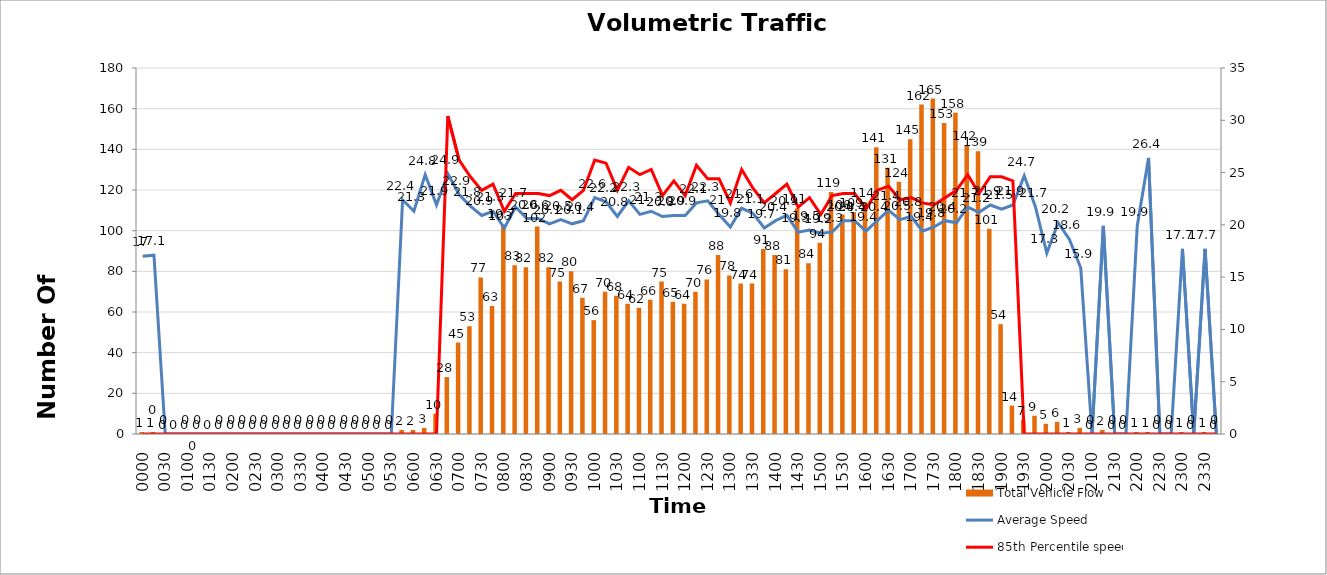
| Category | Total Vehicle Flow |
|---|---|
| 0000 | 1 |
| 0015 | 1 |
| 0030 | 0 |
| 0045 | 0 |
| 0100 | 0 |
| 0115 | 0 |
| 0130 | 0 |
| 0145 | 0 |
| 0200 | 0 |
| 0215 | 0 |
| 0230 | 0 |
| 0245 | 0 |
| 0300 | 0 |
| 0315 | 0 |
| 0330 | 0 |
| 0345 | 0 |
| 0400 | 0 |
| 0415 | 0 |
| 0430 | 0 |
| 0445 | 0 |
| 0500 | 0 |
| 0515 | 0 |
| 0530 | 0 |
| 0545 | 2 |
| 0600 | 2 |
| 0615 | 3 |
| 0630 | 10 |
| 0645 | 28 |
| 0700 | 45 |
| 0715 | 53 |
| 0730 | 77 |
| 0745 | 63 |
| 0800 | 103 |
| 0815 | 83 |
| 0830 | 82 |
| 0845 | 102 |
| 0900 | 82 |
| 0915 | 75 |
| 0930 | 80 |
| 0945 | 67 |
| 1000 | 56 |
| 1015 | 70 |
| 1030 | 68 |
| 1045 | 64 |
| 1100 | 62 |
| 1115 | 66 |
| 1130 | 75 |
| 1145 | 65 |
| 1200 | 64 |
| 1215 | 70 |
| 1230 | 76 |
| 1245 | 88 |
| 1300 | 78 |
| 1315 | 74 |
| 1330 | 74 |
| 1345 | 91 |
| 1400 | 88 |
| 1415 | 81 |
| 1430 | 111 |
| 1445 | 84 |
| 1500 | 94 |
| 1515 | 119 |
| 1530 | 108 |
| 1545 | 109 |
| 1600 | 114 |
| 1615 | 141 |
| 1630 | 131 |
| 1645 | 124 |
| 1700 | 145 |
| 1715 | 162 |
| 1730 | 165 |
| 1745 | 153 |
| 1800 | 158 |
| 1815 | 142 |
| 1830 | 139 |
| 1845 | 101 |
| 1900 | 54 |
| 1915 | 14 |
| 1930 | 7 |
| 1945 | 9 |
| 2000 | 5 |
| 2015 | 6 |
| 2030 | 1 |
| 2045 | 3 |
| 2100 | 0 |
| 2115 | 2 |
| 2130 | 0 |
| 2145 | 0 |
| 2200 | 1 |
| 2215 | 1 |
| 2230 | 0 |
| 2245 | 0 |
| 2300 | 1 |
| 2315 | 0 |
| 2330 | 1 |
| 2345 | 0 |